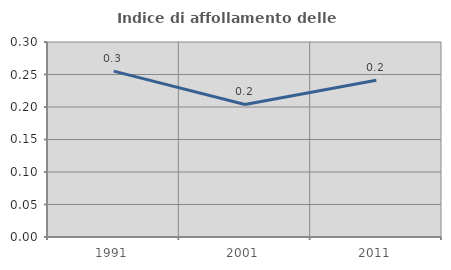
| Category | Indice di affollamento delle abitazioni  |
|---|---|
| 1991.0 | 0.255 |
| 2001.0 | 0.204 |
| 2011.0 | 0.241 |